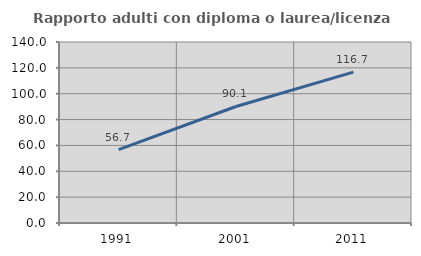
| Category | Rapporto adulti con diploma o laurea/licenza media  |
|---|---|
| 1991.0 | 56.727 |
| 2001.0 | 90.113 |
| 2011.0 | 116.667 |